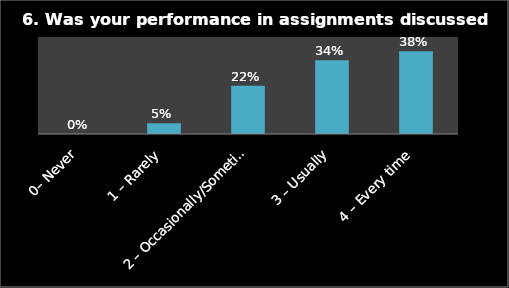
| Category | Series 0 |
|---|---|
| 0– Never | 0 |
| 1 – Rarely | 0.05 |
| 2 – Occasionally/Sometimes | 0.224 |
| 3 – Usually | 0.342 |
| 4 – Every time | 0.384 |